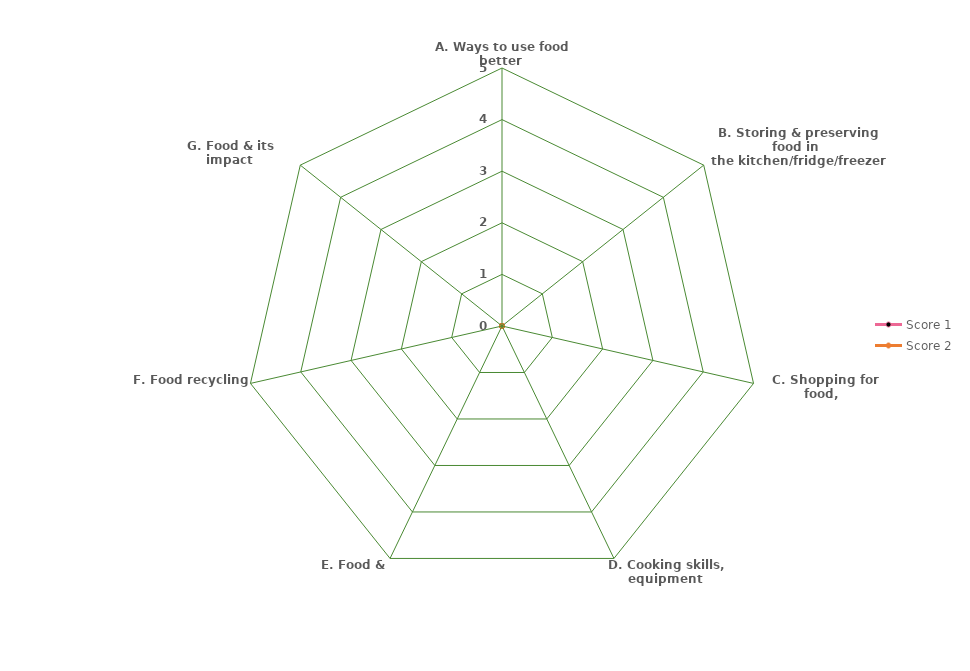
| Category | Score 1 | Score 2 |
|---|---|---|
| A. Ways to use food better 
& reduce waste | 0 | 0 |
| B. Storing & preserving food in 
the kitchen/fridge/freezer | 0 | 0 |
| C. Shopping for food, 
planning & budgeting | 0 | 0 |
| D. Cooking skills, equipment 
& using recipes | 0 | 0 |
| E. Food & packaging | 0 | 0 |
| F. Food recycling 
& composting | 0 | 0 |
| G. Food & its impact 
on climate change | 0 | 0 |